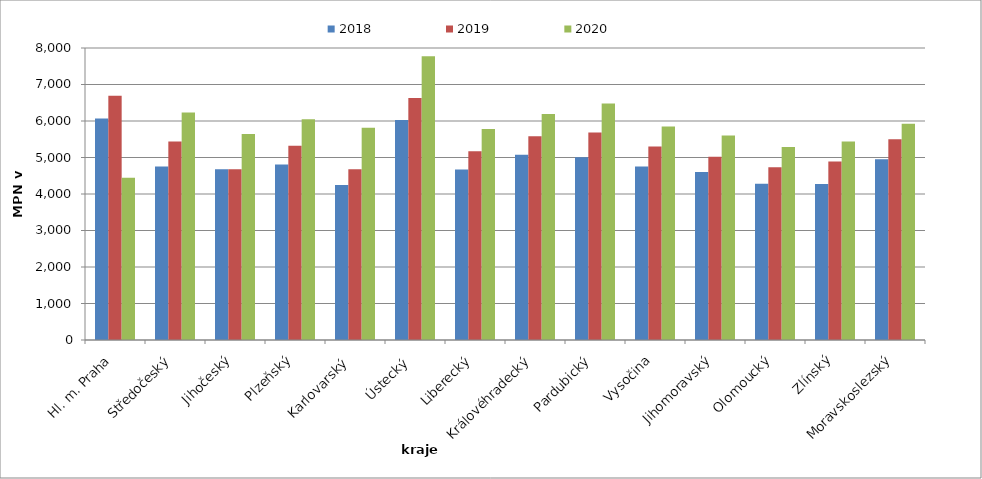
| Category | 2018 | 2019 | 2020 |
|---|---|---|---|
| Hl. m. Praha | 6069 | 6690 | 4442 |
| Středočeský | 4754 | 5441 | 6233 |
| Jihočeský | 4677 | 4677 | 5643 |
| Plzeňský | 4806 | 5319 | 6048 |
| Karlovarský  | 4244 | 4681 | 5813 |
| Ústecký   | 6029 | 6632 | 7775 |
| Liberecký | 4673 | 5170 | 5779 |
| Královéhradecký | 5074 | 5582 | 6195 |
| Pardubický | 5008 | 5687 | 6482 |
| Vysočina | 4752 | 5298 | 5846 |
| Jihomoravský | 4600 | 5023 | 5602 |
| Olomoucký | 4282 | 4731 | 5290 |
| Zlínský | 4271 | 4888 | 5436 |
| Moravskoslezský | 4951 | 5497 | 5923 |